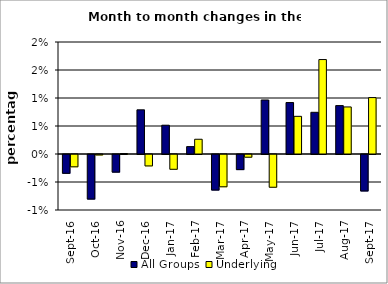
| Category | All Groups | Underlying |
|---|---|---|
| 2016-09-01 | -0.003 | -0.002 |
| 2016-10-01 | -0.008 | 0 |
| 2016-11-01 | -0.003 | 0 |
| 2016-12-01 | 0.008 | -0.002 |
| 2017-01-01 | 0.005 | -0.003 |
| 2017-02-01 | 0.001 | 0.003 |
| 2017-03-01 | -0.006 | -0.006 |
| 2017-04-01 | -0.003 | 0 |
| 2017-05-01 | 0.01 | -0.006 |
| 2017-06-01 | 0.009 | 0.007 |
| 2017-07-01 | 0.007 | 0.017 |
| 2017-08-01 | 0.009 | 0.008 |
| 2017-09-01 | -0.007 | 0.01 |